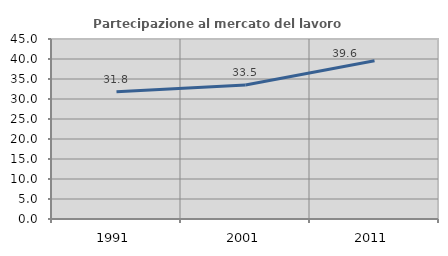
| Category | Partecipazione al mercato del lavoro  femminile |
|---|---|
| 1991.0 | 31.787 |
| 2001.0 | 33.516 |
| 2011.0 | 39.555 |